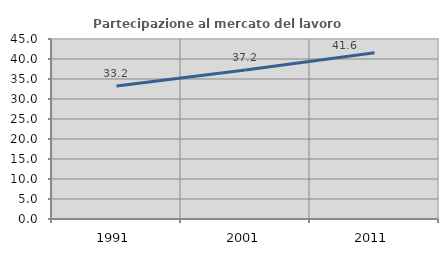
| Category | Partecipazione al mercato del lavoro  femminile |
|---|---|
| 1991.0 | 33.228 |
| 2001.0 | 37.232 |
| 2011.0 | 41.573 |